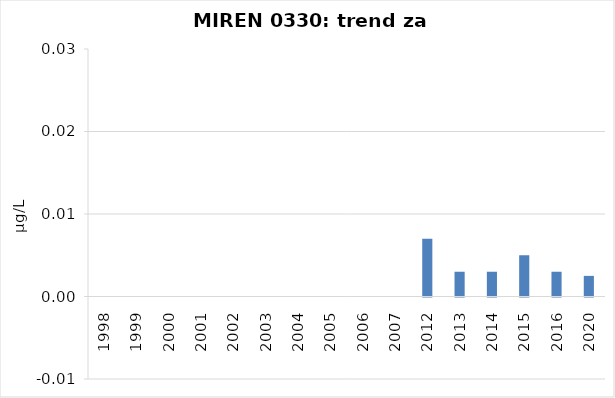
| Category | Vsota |
|---|---|
| 1998 | 0 |
| 1999 | 0 |
| 2000 | 0 |
| 2001 | 0 |
| 2002 | 0 |
| 2003 | 0 |
| 2004 | 0 |
| 2005 | 0 |
| 2006 | 0 |
| 2007 | 0 |
| 2012 | 0.007 |
| 2013 | 0.003 |
| 2014 | 0.003 |
| 2015 | 0.005 |
| 2016 | 0.003 |
| 2020 | 0.002 |